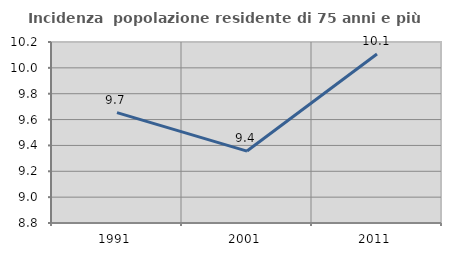
| Category | Incidenza  popolazione residente di 75 anni e più |
|---|---|
| 1991.0 | 9.654 |
| 2001.0 | 9.356 |
| 2011.0 | 10.107 |